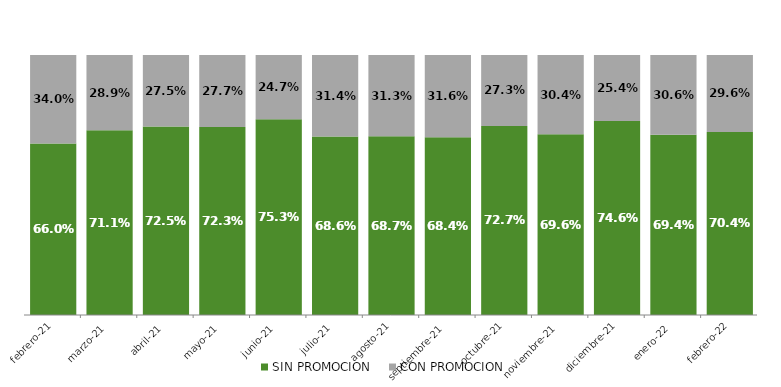
| Category | SIN PROMOCION   | CON PROMOCION   |
|---|---|---|
| 2021-02-01 | 0.66 | 0.34 |
| 2021-03-01 | 0.711 | 0.289 |
| 2021-04-01 | 0.725 | 0.275 |
| 2021-05-01 | 0.723 | 0.277 |
| 2021-06-01 | 0.753 | 0.247 |
| 2021-07-01 | 0.686 | 0.314 |
| 2021-08-01 | 0.687 | 0.313 |
| 2021-09-01 | 0.684 | 0.316 |
| 2021-10-01 | 0.727 | 0.273 |
| 2021-11-01 | 0.696 | 0.304 |
| 2021-12-01 | 0.746 | 0.254 |
| 2022-01-01 | 0.694 | 0.306 |
| 2022-02-01 | 0.704 | 0.296 |